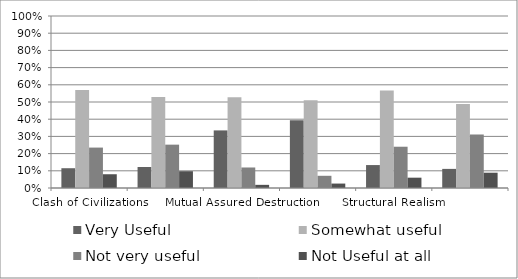
| Category | Very Useful | Somewhat useful | Not very useful | Not Useful at all |
|---|---|---|---|---|
| Clash of Civilizations | 0.115 | 0.57 | 0.235 | 0.08 |
| Democratic Peace Theory | 0.122 | 0.528 | 0.252 | 0.098 |
| Mutual Assured Destruction | 0.335 | 0.528 | 0.119 | 0.018 |
| Population Centric COIN | 0.394 | 0.51 | 0.071 | 0.026 |
| Structural Realism | 0.133 | 0.567 | 0.24 | 0.06 |
| Expected Utility | 0.111 | 0.489 | 0.311 | 0.089 |